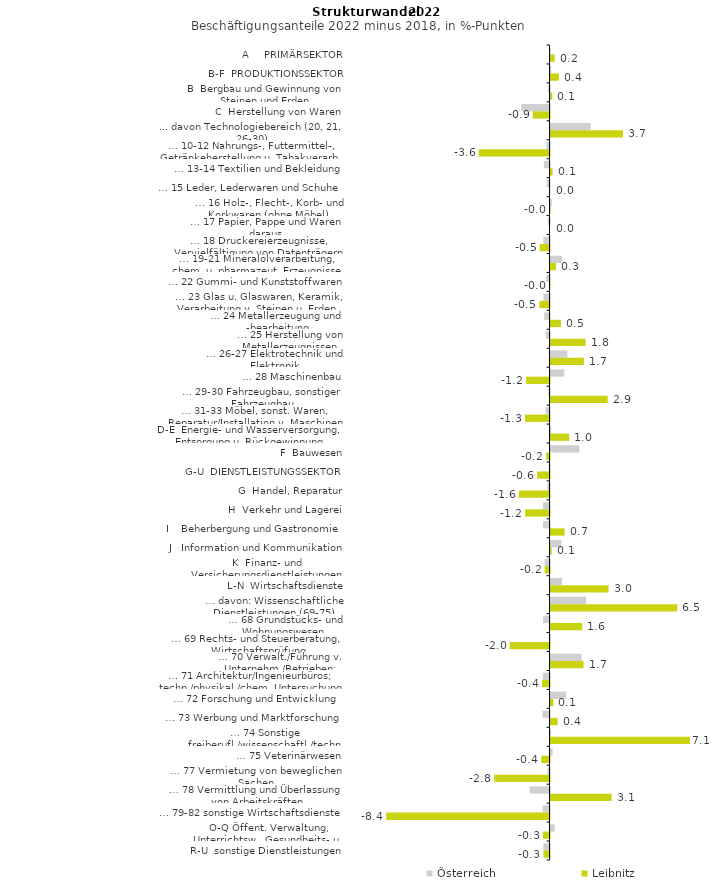
| Category | Österreich | Leibnitz |
|---|---|---|
| A     PRIMÄRSEKTOR | 0.004 | 0.209 |
| B-F  PRODUKTIONSSEKTOR | 0.036 | 0.43 |
| B  Bergbau und Gewinnung von Steinen und Erden | -0.063 | 0.091 |
| C  Herstellung von Waren | -1.445 | -0.86 |
| ... davon Technologiebereich (20, 21, 26-30) | 2.047 | 3.702 |
| … 10-12 Nahrungs-, Futtermittel-, Getränkeherstellung u. Tabakverarb. | -0.163 | -3.625 |
| … 13-14 Textilien und Bekleidung | -0.292 | 0.105 |
| … 15 Leder, Lederwaren und Schuhe | -0.15 | 0 |
| … 16 Holz-, Flecht-, Korb- und Korkwaren (ohne Möbel)  | 0.068 | -0.022 |
| … 17 Papier, Pappe und Waren daraus  | -0.09 | 0 |
| … 18 Druckereierzeugnisse, Vervielfältigung von Datenträgern | -0.314 | -0.505 |
| … 19-21 Mineralölverarbeitung, chem. u. pharmazeut. Erzeugnisse | 0.584 | 0.275 |
| … 22 Gummi- und Kunststoffwaren | -0.168 | -0.021 |
| … 23 Glas u. Glaswaren, Keramik, Verarbeitung v. Steinen u. Erden  | -0.312 | -0.521 |
| … 24 Metallerzeugung und -bearbeitung | -0.276 | 0.532 |
| … 25 Herstellung von Metallerzeugnissen  | -0.185 | 1.795 |
| … 26-27 Elektrotechnik und Elektronik | 0.862 | 1.704 |
| … 28 Maschinenbau | 0.705 | -1.199 |
| … 29-30 Fahrzeugbau, sonstiger Fahrzeugbau | -0.066 | 2.922 |
| … 31-33 Möbel, sonst. Waren, Reparatur/Installation v. Maschinen | -0.204 | -1.256 |
| D-E  Energie- und Wasserversorgung, Entsorgung u. Rückgewinnung | 0.038 | 0.956 |
| F  Bauwesen | 1.469 | -0.174 |
| G-U  DIENSTLEISTUNGSSEKTOR | -0.04 | -0.639 |
| G  Handel, Reparatur | -0.115 | -1.568 |
| H  Verkehr und Lagerei | -0.33 | -1.25 |
| I    Beherbergung und Gastronomie | -0.34 | 0.718 |
| J   Information und Kommunikation | 0.551 | 0.057 |
| K  Finanz- und Versicherungsdienstleistungen | -0.255 | -0.25 |
| L-N  Wirtschaftsdienste | 0.586 | 2.966 |
| … davon: Wissenschaftliche Dienstleistungen (69-75) | 1.815 | 6.482 |
| … 68 Grundstücks- und Wohnungswesen  | -0.331 | 1.623 |
| … 69 Rechts- und Steuerberatung, Wirtschaftsprüfung | 0.008 | -2.043 |
| … 70 Verwalt./Führung v. Unternehm./Betrieben; Unternehmensberat. | 1.583 | 1.689 |
| … 71 Architektur/Ingenieurbüros; techn./physikal./chem. Untersuchung | -0.344 | -0.387 |
| … 72 Forschung und Entwicklung  | 0.797 | 0.143 |
| … 73 Werbung und Marktforschung | -0.361 | 0.362 |
| … 74 Sonstige freiberufl./wissenschaftl./techn. Tätigkeiten | 0.025 | 7.126 |
| … 75 Veterinärwesen | 0.108 | -0.425 |
| … 77 Vermietung von beweglichen Sachen  | -0.116 | -2.825 |
| … 78 Vermittlung und Überlassung von Arbeitskräften | -1.018 | 3.12 |
| … 79-82 sonstige Wirtschaftsdienste | -0.351 | -8.355 |
| O-Q Öffent. Verwaltung, Unterrichtsw., Gesundheits- u. Sozialwesen | 0.216 | -0.344 |
| R-U  sonstige Dienstleistungen | -0.314 | -0.316 |